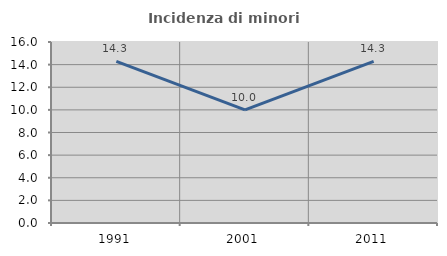
| Category | Incidenza di minori stranieri |
|---|---|
| 1991.0 | 14.286 |
| 2001.0 | 10 |
| 2011.0 | 14.286 |